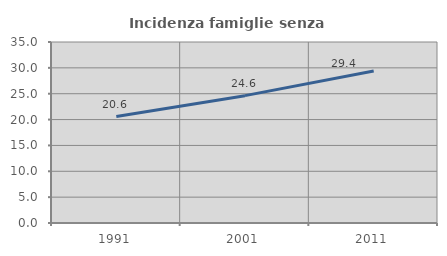
| Category | Incidenza famiglie senza nuclei |
|---|---|
| 1991.0 | 20.594 |
| 2001.0 | 24.626 |
| 2011.0 | 29.408 |